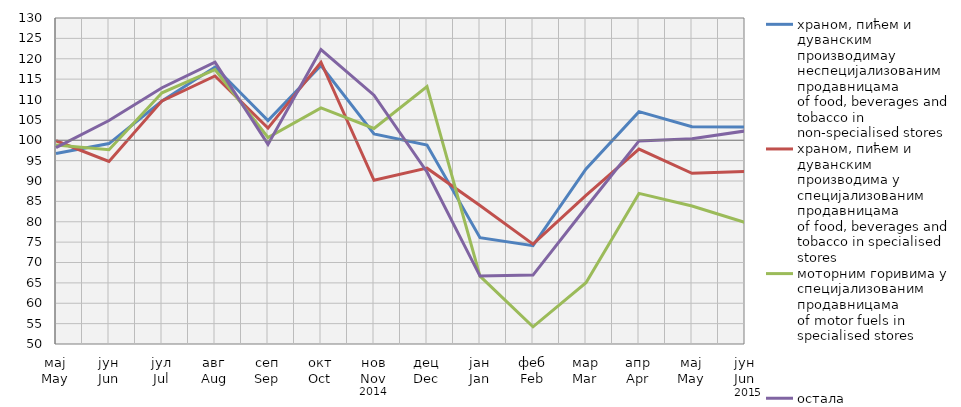
| Category | храном, пићем и дуванским производимау неспецијализованим продавницама
of food, beverages and tobacco in non-specialised stores | храном, пићем и дуванским производима у специјализовaним продавницама
of food, beverages and tobacco in specialised stores | моторним горивима у специјализованим продавницама
of motor fuels in specialised stores | остала
other |
|---|---|---|---|---|
| мај
May | 96.746 | 99.877 | 98.808 | 98.199 |
| јун
Jun | 99.188 | 94.792 | 97.692 | 104.846 |
| јул
Jul | 109.625 | 109.667 | 111.647 | 112.88 |
| авг
Aug | 117.962 | 115.777 | 117.35 | 119.168 |
| сеп
Sep | 104.816 | 102.987 | 100.667 | 98.985 |
| окт
Oct | 118.329 | 119.147 | 107.958 | 122.269 |
| нов
Nov | 101.543 | 90.168 | 102.886 | 111.05 |
| дец
Dec | 98.841 | 93.152 | 113.178 | 92.21 |
| јан
Jan | 76.105 | 83.983 | 66.659 | 66.673 |
| феб
Feb | 74.124 | 74.495 | 54.212 | 66.916 |
| мар
Mar | 92.948 | 86.45 | 65.042 | 83.485 |
| апр
Apr | 107.029 | 97.818 | 86.958 | 99.837 |
| мај
May | 103.34 | 91.883 | 83.858 | 100.375 |
| јун
Jun | 103.24 | 92.338 | 79.832 | 102.276 |